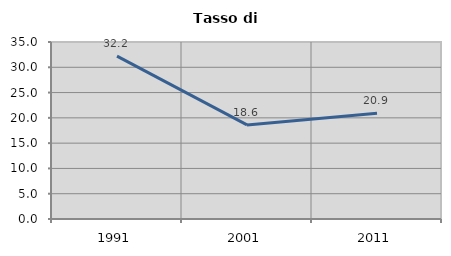
| Category | Tasso di disoccupazione   |
|---|---|
| 1991.0 | 32.203 |
| 2001.0 | 18.598 |
| 2011.0 | 20.89 |